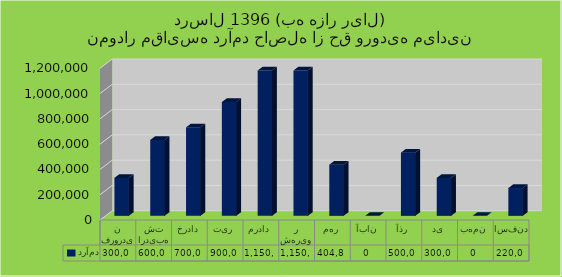
| Category | درآمد |
|---|---|
| فروردین | 300000 |
| اردیبهشت | 600000 |
| خرداد | 700000 |
| تیر | 900000 |
| مرداد | 1150000 |
| شهریور | 1150000 |
| مهر | 404800 |
| آبان | 0 |
| آذر | 500000 |
| دی | 300000 |
| بهمن | 0 |
| اسفند | 220000 |